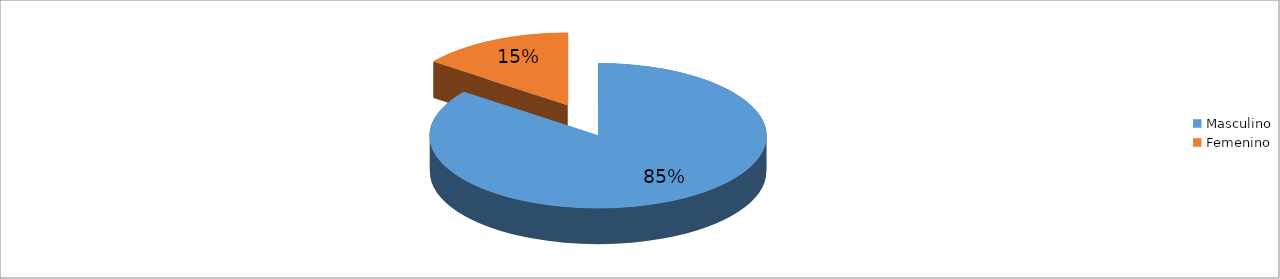
| Category | Series 0 |
|---|---|
| Masculino | 0.853 |
| Femenino | 0.147 |